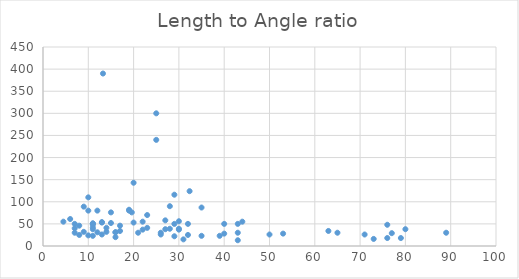
| Category | Series 0 |
|---|---|
| 13.24 | 390 |
| 32.36 | 124 |
| 16.0 | 31 |
| 4.5 | 55 |
| 30.0 | 56 |
| 19.6 | 76 |
| 7.0 | 40 |
| 7.0 | 50 |
| 65.0 | 30 |
| 16.0 | 31 |
| 43.0 | 50 |
| 30.0 | 37 |
| 25.0 | 240 |
| 40.0 | 50 |
| 63.0 | 34 |
| 71.0 | 26 |
| 25.0 | 300 |
| 8.0 | 46 |
| 89.0 | 30 |
| 40.0 | 28 |
| 11.0 | 38 |
| 11.0 | 23 |
| 32.0 | 50 |
| 22.0 | 55 |
| 21.0 | 30 |
| 14.0 | 32 |
| 29.0 | 50 |
| 26.0 | 26 |
| 23.0 | 70 |
| 29.0 | 22 |
| 23.0 | 41 |
| 17.0 | 34 |
| 44.0 | 55 |
| 12.0 | 80 |
| 11.0 | 42 |
| 76.0 | 48 |
| 11.0 | 51 |
| 15.0 | 76 |
| 14.0 | 41 |
| 10.0 | 24 |
| 35.0 | 23 |
| 50.0 | 26 |
| 77.0 | 29 |
| 19.0 | 82 |
| 28.0 | 39 |
| 26.0 | 30 |
| 16.0 | 20 |
| 32.0 | 25 |
| 76.0 | 18 |
| 6.0 | 61 |
| 10.0 | 80 |
| 9.0 | 89 |
| 27.0 | 58 |
| 73.0 | 16 |
| 9.0 | 32 |
| 13.0 | 26 |
| 43.0 | 30 |
| 20.0 | 53 |
| 19.0 | 80 |
| 8.0 | 25 |
| 31.0 | 15 |
| 13.0 | 53 |
| 35.0 | 87 |
| 30.0 | 39 |
| 7.0 | 30 |
| 22.0 | 37 |
| 20.0 | 143 |
| 29.0 | 116 |
| 10.0 | 110 |
| 11.0 | 48 |
| 11.0 | 51 |
| 13.0 | 54 |
| 43.0 | 13 |
| 79.0 | 18 |
| 28.0 | 90 |
| 27.0 | 38 |
| 53.0 | 28 |
| 80.0 | 38 |
| 15.0 | 52 |
| 39.0 | 23 |
| 17.0 | 46 |
| 12.0 | 31 |